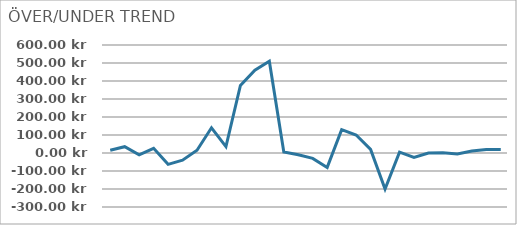
| Category | SKILLNAD |
|---|---|
| 0 | 15 |
| 1 | 35 |
| 2 | -10 |
| 3 | 26 |
| 4 | -63 |
| 5 | -40 |
| 6 | 15 |
| 7 | 140 |
| 8 | 35 |
| 9 | 375 |
| 10 | 460 |
| 11 | 510 |
| 12 | 6 |
| 13 | -10 |
| 14 | -30 |
| 15 | -80 |
| 16 | 130 |
| 17 | 100 |
| 18 | 20 |
| 19 | -200 |
| 20 | 5 |
| 21 | -25 |
| 22 | 0 |
| 23 | 1 |
| 24 | -5 |
| 25 | 11 |
| 26 | 20 |
| 27 | 20 |